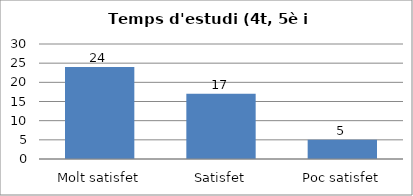
| Category | Series 0 |
|---|---|
| Molt satisfet | 24 |
| Satisfet | 17 |
| Poc satisfet | 5 |